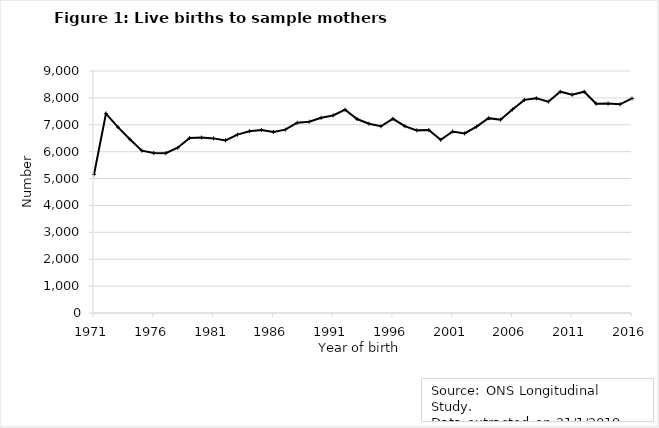
| Category | Series 0 |
|---|---|
| 1971.0 | 5152 |
| 1972.0 | 7414 |
| 1973.0 | 6914 |
| 1974.0 | 6461 |
| 1975.0 | 6039 |
| 1976.0 | 5950 |
| 1977.0 | 5945 |
| 1978.0 | 6146 |
| 1979.0 | 6509 |
| 1980.0 | 6524 |
| 1981.0 | 6494 |
| 1982.0 | 6419 |
| 1983.0 | 6634 |
| 1984.0 | 6761 |
| 1985.0 | 6808 |
| 1986.0 | 6734 |
| 1987.0 | 6818 |
| 1988.0 | 7076 |
| 1989.0 | 7116 |
| 1990.0 | 7259 |
| 1991.0 | 7348 |
| 1992.0 | 7562 |
| 1993.0 | 7214 |
| 1994.0 | 7040 |
| 1995.0 | 6944 |
| 1996.0 | 7223 |
| 1997.0 | 6947 |
| 1998.0 | 6792 |
| 1999.0 | 6804 |
| 2000.0 | 6442 |
| 2001.0 | 6751 |
| 2002.0 | 6679 |
| 2003.0 | 6932 |
| 2004.0 | 7246 |
| 2005.0 | 7189 |
| 2006.0 | 7569 |
| 2007.0 | 7927 |
| 2008.0 | 7984 |
| 2009.0 | 7857 |
| 2010.0 | 8231 |
| 2011.0 | 8118 |
| 2012.0 | 8229 |
| 2013.0 | 7783 |
| 2014.0 | 7788 |
| 2015.0 | 7761 |
| 2016.0 | 7978 |